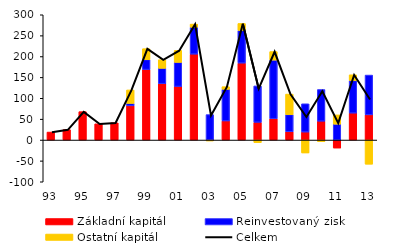
| Category | Základní kapitál | Reinvestovaný zisk | Ostatní kapitál |
|---|---|---|---|
| 93 | 19.1 | 0 | 0 |
| 94 | 25 | 0 | 0 |
| 95 | 68 | 0 | 0 |
| 96 | 38.8 | 0 | 0 |
| 97 | 41.3 | 0 | 0 |
| 98 | 81.9 | 5.8 | 32.3 |
| 99 | 168.7 | 23.9 | 26.2 |
| 00 | 134.9 | 36.9 | 20.6 |
| 01 | 128.2 | 57.8 | 28.6 |
| 02 | 205.7 | 64.4 | 7.6 |
| 03 | -1.5 | 60.9 | -0.1 |
| 04 | 45.7 | 75.8 | 6.3 |
| 05 | 184.3 | 78.2 | 16.7 |
| 06 | 42.4 | 87.2 | -6.2 |
| 07 | 51 | 140.5 | 20.4 |
| 08 | 19.7 | 41.2 | 49.2 |
| 09 | 19.1 | 67.7 | -31 |
| 10 | 45.1 | 75.9 | -3.8 |
| 11 | -19.2 | 38 | 22.2 |
| 12 | 64.5 | 78 | 13.8 |
| 13 | 60.3 | 95.3 | -57.9 |